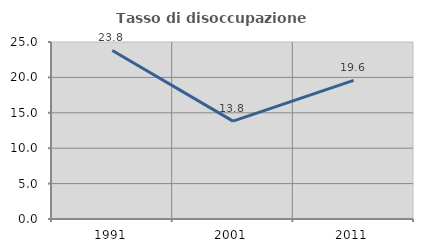
| Category | Tasso di disoccupazione giovanile  |
|---|---|
| 1991.0 | 23.81 |
| 2001.0 | 13.821 |
| 2011.0 | 19.588 |